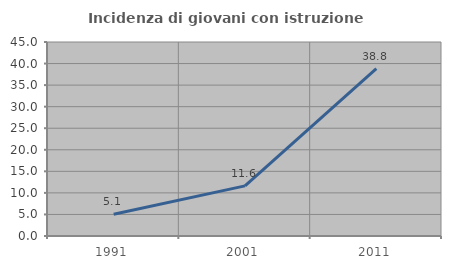
| Category | Incidenza di giovani con istruzione universitaria |
|---|---|
| 1991.0 | 5.051 |
| 2001.0 | 11.628 |
| 2011.0 | 38.824 |